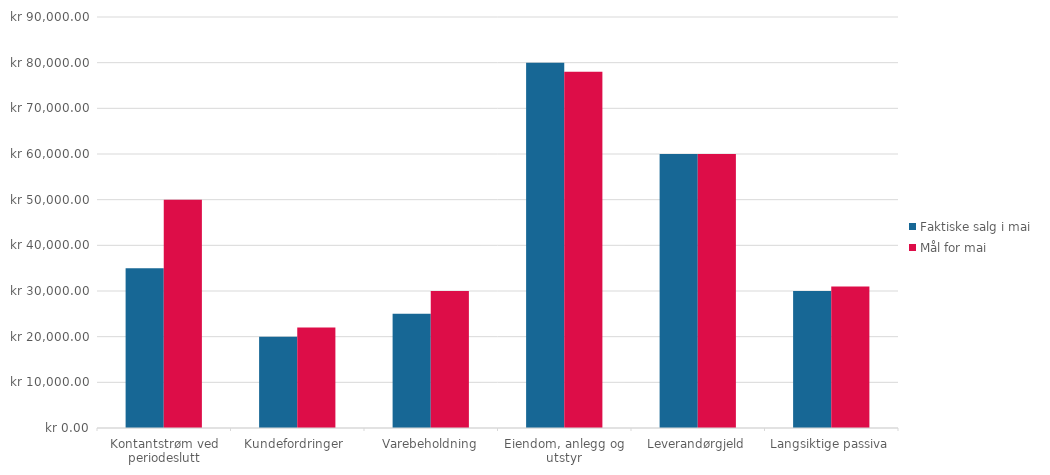
| Category | Faktiske salg i mai | Mål for mai |
|---|---|---|
| Kontantstrøm ved periodeslutt | 35000 | 50000 |
| Kundefordringer  | 20000 | 22000 |
| Varebeholdning | 25000 | 30000 |
| Eiendom, anlegg og utstyr | 80000 | 78000 |
| Leverandørgjeld | 60000 | 60000 |
| Langsiktige passiva | 30000 | 31000 |